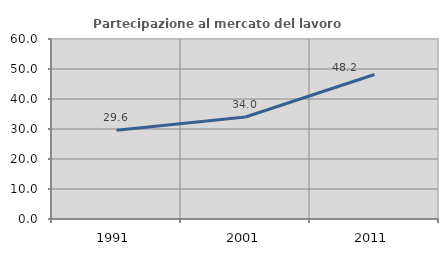
| Category | Partecipazione al mercato del lavoro  femminile |
|---|---|
| 1991.0 | 29.582 |
| 2001.0 | 33.984 |
| 2011.0 | 48.177 |